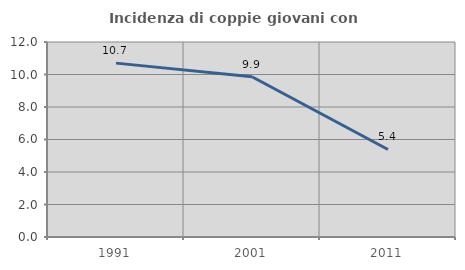
| Category | Incidenza di coppie giovani con figli |
|---|---|
| 1991.0 | 10.7 |
| 2001.0 | 9.864 |
| 2011.0 | 5.387 |